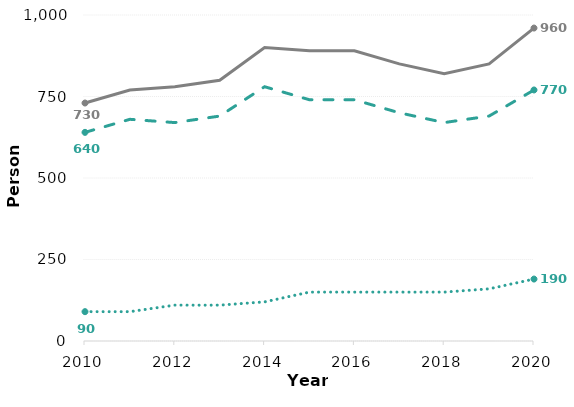
| Category | Persons | Females | Males |
|---|---|---|---|
| 2010.0 | 730 | 640 | 90 |
| 2011.0 | 770 | 680 | 90 |
| 2012.0 | 780 | 670 | 110 |
| 2013.0 | 800 | 690 | 110 |
| 2014.0 | 900 | 780 | 120 |
| 2015.0 | 890 | 740 | 150 |
| 2016.0 | 890 | 740 | 150 |
| 2017.0 | 850 | 700 | 150 |
| 2018.0 | 820 | 670 | 150 |
| 2019.0 | 850 | 690 | 160 |
| 2020.0 | 960 | 770 | 190 |